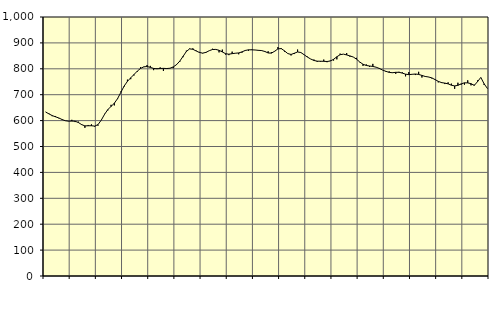
| Category | Piggar | Series 1 |
|---|---|---|
| nan | 633.6 | 633.08 |
| 87.0 | 627.7 | 626 |
| 87.0 | 617.1 | 619.41 |
| 87.0 | 617.8 | 614.75 |
| nan | 609 | 610.29 |
| 88.0 | 605.6 | 604.32 |
| 88.0 | 599.4 | 599.57 |
| 88.0 | 598.3 | 597.74 |
| nan | 603 | 598.11 |
| 89.0 | 594.3 | 597.67 |
| 89.0 | 596 | 592.61 |
| 89.0 | 582.9 | 584.55 |
| nan | 572.2 | 579.69 |
| 90.0 | 583.1 | 580.03 |
| 90.0 | 585.5 | 580.15 |
| 90.0 | 576.5 | 578.68 |
| nan | 580.4 | 584.49 |
| 91.0 | 601.8 | 601.72 |
| 91.0 | 626 | 624.06 |
| 91.0 | 639.4 | 642.55 |
| nan | 660.9 | 654.74 |
| 92.0 | 658.7 | 667.22 |
| 92.0 | 683.1 | 685.25 |
| 92.0 | 712.5 | 709.42 |
| nan | 731.7 | 733.52 |
| 93.0 | 758.1 | 751.6 |
| 93.0 | 759.9 | 765.16 |
| 93.0 | 774.2 | 777.89 |
| nan | 788.5 | 790.82 |
| 94.0 | 806.3 | 801.35 |
| 94.0 | 806.6 | 807.58 |
| 94.0 | 814.7 | 808.75 |
| nan | 811.2 | 805.51 |
| 95.0 | 794.8 | 801.41 |
| 95.0 | 802.3 | 800.06 |
| 95.0 | 805.5 | 801.14 |
| nan | 791.5 | 801.71 |
| 96.0 | 803 | 801.02 |
| 96.0 | 801.8 | 802.18 |
| 96.0 | 802.5 | 807.28 |
| nan | 817.5 | 815.88 |
| 97.0 | 826.6 | 829.72 |
| 97.0 | 845 | 848.08 |
| 97.0 | 870 | 866.78 |
| nan | 878.3 | 876.9 |
| 98.0 | 878.9 | 875.38 |
| 98.0 | 870.4 | 868.76 |
| 98.0 | 865.3 | 863.02 |
| nan | 859.4 | 860.53 |
| 99.0 | 864.9 | 863.41 |
| 99.0 | 870 | 869.89 |
| 99.0 | 877.4 | 874.47 |
| nan | 875.5 | 874.83 |
| 0.0 | 863.4 | 871.5 |
| 0.0 | 874 | 865 |
| 0.0 | 854.8 | 858.27 |
| nan | 852.7 | 856.4 |
| 1.0 | 866.2 | 858.5 |
| 1.0 | 859.7 | 860.11 |
| 1.0 | 856 | 861.25 |
| nan | 862.1 | 865.33 |
| 2.0 | 872 | 870.74 |
| 2.0 | 869.7 | 873.3 |
| 2.0 | 874.6 | 873.3 |
| nan | 872.5 | 872.59 |
| 3.0 | 870 | 871.37 |
| 3.0 | 871.6 | 870.4 |
| 3.0 | 865.4 | 866.84 |
| nan | 867.6 | 861.12 |
| 4.0 | 864.2 | 860.48 |
| 4.0 | 866.7 | 867.82 |
| 4.0 | 883.8 | 876.99 |
| nan | 879.9 | 878.01 |
| 5.0 | 866.3 | 869.28 |
| 5.0 | 858.5 | 858.87 |
| 5.0 | 851.5 | 855.37 |
| nan | 857 | 860.04 |
| 6.0 | 874.3 | 864.96 |
| 6.0 | 862.1 | 862.83 |
| 6.0 | 854.8 | 854.29 |
| nan | 847 | 845.28 |
| 7.0 | 837.7 | 837.86 |
| 7.0 | 835.7 | 832.16 |
| 7.0 | 826.5 | 829.5 |
| nan | 827.4 | 829.2 |
| 8.0 | 835.6 | 828.85 |
| 8.0 | 825.5 | 828.13 |
| 8.0 | 831.8 | 830.08 |
| nan | 831.9 | 836.6 |
| 9.0 | 836.5 | 846.45 |
| 9.0 | 858.6 | 854.4 |
| 9.0 | 856.6 | 856.64 |
| nan | 860.8 | 853.58 |
| 10.0 | 846.9 | 849.75 |
| 10.0 | 845.6 | 845.57 |
| 10.0 | 842.3 | 837.4 |
| nan | 825.3 | 826.29 |
| 11.0 | 811.4 | 817.49 |
| 11.0 | 816.9 | 812.81 |
| 11.0 | 806.9 | 810.87 |
| nan | 819 | 809.04 |
| 12.0 | 806.4 | 806.18 |
| 12.0 | 803.2 | 801.27 |
| 12.0 | 795.4 | 794.96 |
| nan | 788.5 | 790.13 |
| 13.0 | 790.1 | 786.13 |
| 13.0 | 783.8 | 784.83 |
| 13.0 | 780.5 | 786.38 |
| nan | 788.3 | 786.54 |
| 14.0 | 786.5 | 783.38 |
| 14.0 | 770.9 | 779.26 |
| 14.0 | 787.3 | 777.48 |
| nan | 778.9 | 778.75 |
| 15.0 | 775.9 | 779.86 |
| 15.0 | 788.4 | 778.29 |
| 15.0 | 766.3 | 774.47 |
| nan | 771.5 | 770.44 |
| 16.0 | 768 | 768.47 |
| 16.0 | 762.9 | 764.97 |
| 16.0 | 759.7 | 758.46 |
| nan | 747.5 | 751.56 |
| 17.0 | 748.7 | 746.65 |
| 17.0 | 741.1 | 744.81 |
| 17.0 | 747.7 | 741.86 |
| nan | 742.7 | 736.62 |
| 18.0 | 722.5 | 733.93 |
| 18.0 | 746.2 | 736.08 |
| 18.0 | 738.7 | 741.86 |
| nan | 738.6 | 745.89 |
| 19.0 | 755.6 | 745.59 |
| 19.0 | 736.1 | 742.52 |
| 19.0 | 738.5 | 735.95 |
| nan | 755.1 | 750.51 |
| 20.0 | 766.9 | 766.82 |
| 20.0 | 737.8 | 742.18 |
| 20.0 | 723.3 | 724.4 |